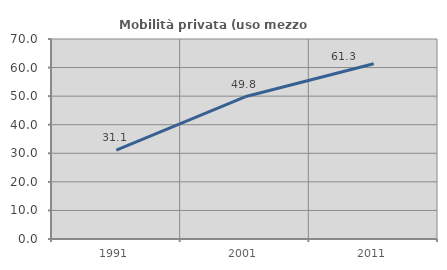
| Category | Mobilità privata (uso mezzo privato) |
|---|---|
| 1991.0 | 31.12 |
| 2001.0 | 49.779 |
| 2011.0 | 61.314 |